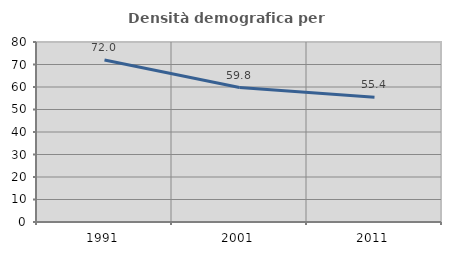
| Category | Densità demografica |
|---|---|
| 1991.0 | 71.972 |
| 2001.0 | 59.763 |
| 2011.0 | 55.415 |